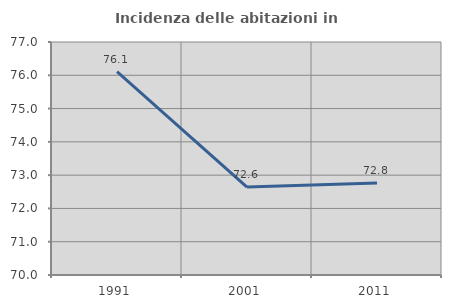
| Category | Incidenza delle abitazioni in proprietà  |
|---|---|
| 1991.0 | 76.111 |
| 2001.0 | 72.642 |
| 2011.0 | 72.766 |